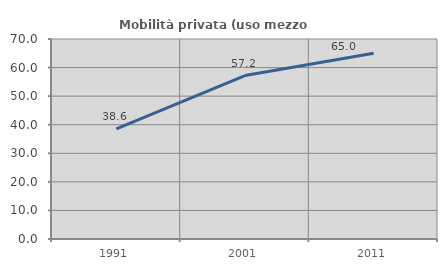
| Category | Mobilità privata (uso mezzo privato) |
|---|---|
| 1991.0 | 38.569 |
| 2001.0 | 57.198 |
| 2011.0 | 65.041 |